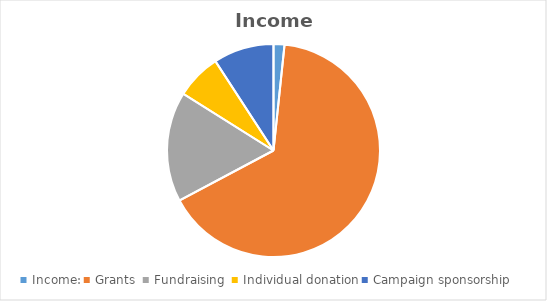
| Category | Series 0 | Series 1 |
|---|---|---|
| Income: | 2020 | 2021 |
| Grants  | 80000 | 80000 |
| Fundraising  | 20400 | 20400 |
| Individual donation | 8400 | 8400 |
| Campaign sponsorship | 11200 | 11200 |